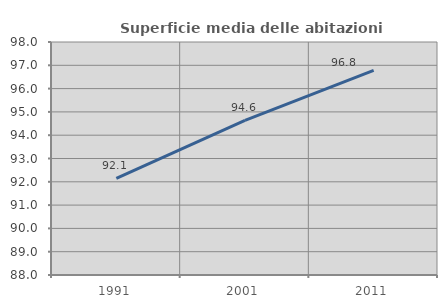
| Category | Superficie media delle abitazioni occupate |
|---|---|
| 1991.0 | 92.146 |
| 2001.0 | 94.635 |
| 2011.0 | 96.783 |